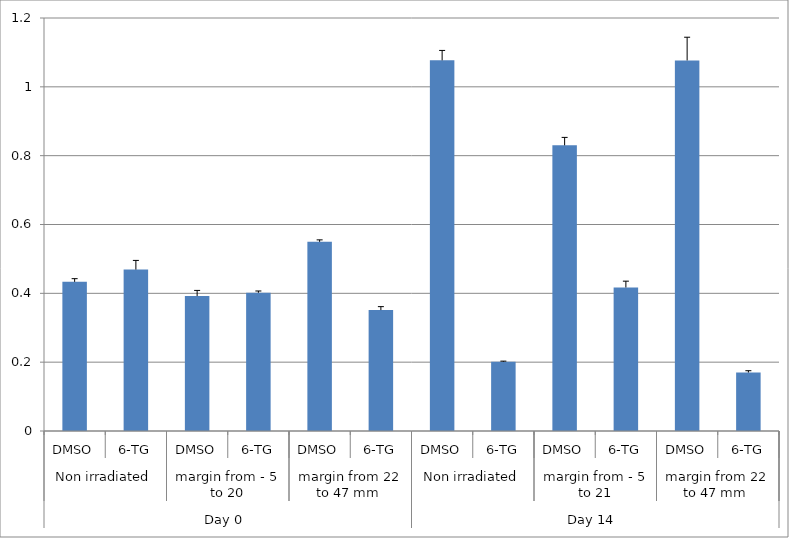
| Category | Series 0 |
|---|---|
| 0 | 0.433 |
| 1 | 0.469 |
| 2 | 0.392 |
| 3 | 0.402 |
| 4 | 0.55 |
| 5 | 0.351 |
| 6 | 1.077 |
| 7 | 0.201 |
| 8 | 0.83 |
| 9 | 0.417 |
| 10 | 1.077 |
| 11 | 0.17 |